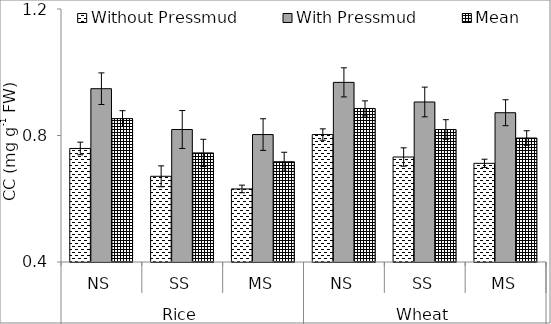
| Category | Without Pressmud | With Pressmud | Mean |
|---|---|---|---|
| 0 | 0.759 | 0.948 | 0.853 |
| 1 | 0.671 | 0.819 | 0.745 |
| 2 | 0.631 | 0.803 | 0.717 |
| 3 | 0.803 | 0.968 | 0.886 |
| 4 | 0.732 | 0.906 | 0.819 |
| 5 | 0.712 | 0.872 | 0.792 |